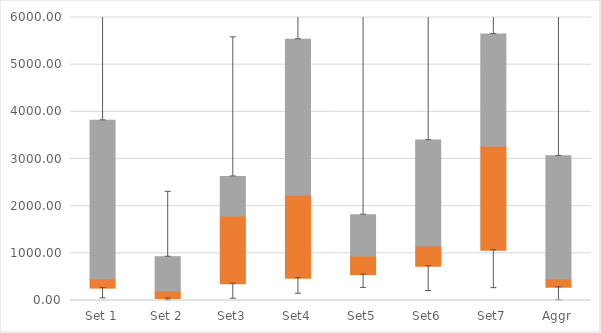
| Category | Q1 | Median-Q1 | Q3-Median |
|---|---|---|---|
| Set 1 | 262.42 | 191.104 | 3366.661 |
| Set 2 | 42.812 | 155.188 | 730.897 |
| Set3 | 356.171 | 1433.594 | 841.4 |
| Set4 | 473.745 | 1756.865 | 3308.53 |
| Set5 | 548.408 | 396.731 | 874.457 |
| Set6 | 726.524 | 429.524 | 2245.453 |
| Set7 | 1065.057 | 2204.161 | 2383.585 |
| Aggr | 280.866 | 172.657 | 2613.06 |